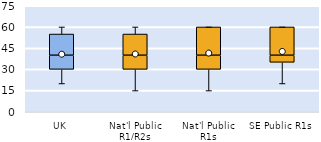
| Category | 25th | 50th | 75th |
|---|---|---|---|
| UK | 30 | 10 | 15 |
| Nat'l Public R1/R2s | 30 | 10 | 15 |
| Nat'l Public R1s | 30 | 10 | 20 |
| SE Public R1s | 35 | 5 | 20 |